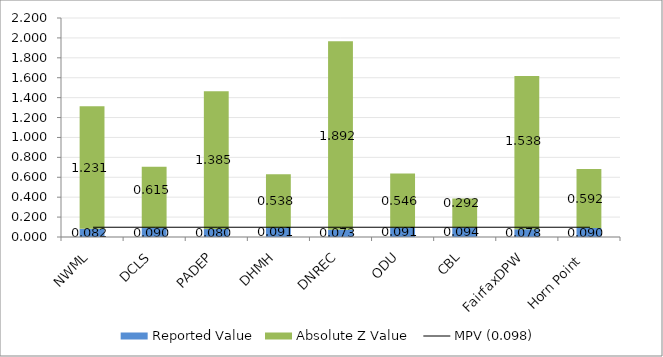
| Category | Reported Value | Absolute Z Value  |
|---|---|---|
| NWML | 0.082 | 1.231 |
| DCLS | 0.09 | 0.615 |
| PADEP | 0.08 | 1.385 |
| DHMH | 0.091 | 0.538 |
| DNREC | 0.073 | 1.892 |
| ODU | 0.091 | 0.546 |
| CBL | 0.094 | 0.292 |
| FairfaxDPW | 0.078 | 1.538 |
| Horn Point  | 0.09 | 0.592 |